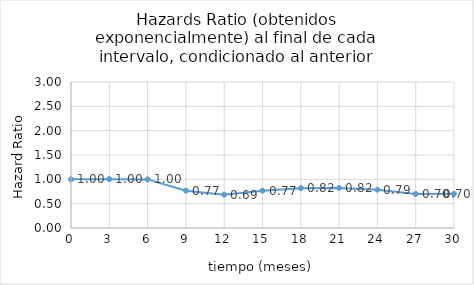
| Category | Series 0 |
|---|---|
| 0.0 | 1 |
| 3.0 | 1.004 |
| 6.0 | 0.999 |
| 9.0 | 0.767 |
| 12.0 | 0.685 |
| 15.0 | 0.768 |
| 18.0 | 0.818 |
| 21.0 | 0.824 |
| 24.0 | 0.787 |
| 27.0 | 0.699 |
| 30.0 | 0.702 |